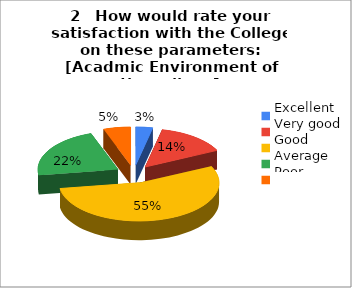
| Category | 2   How would rate your
satisfaction with the College on these parameters:                             [Acadmic Environment of the college] |
|---|---|
| Excellent | 5 |
| Very good | 21 |
| Good | 80 |
| Average | 32 |
| Poor | 8 |